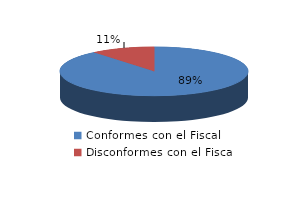
| Category | Series 0 |
|---|---|
| 0 | 57 |
| 1 | 7 |